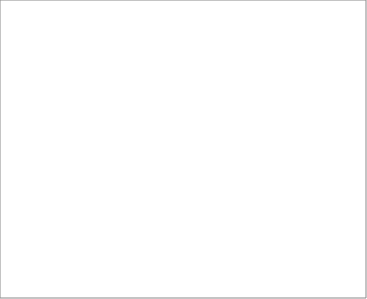
| Category | 2004 | 2005 | 2006 | 2008 | 2009 | 2010 | 2011 | 2012 | 2013 |
|---|---|---|---|---|---|---|---|---|---|
| Belgia | 3 |  |  |  |  |  |  |  |  |